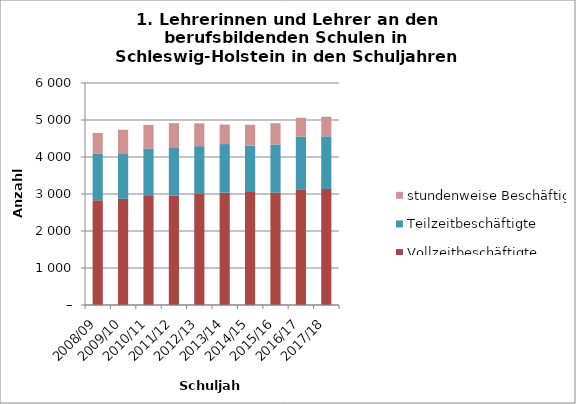
| Category | Vollzeitbeschäftigte | Teilzeitbeschäftigte | stundenweise Beschäftigte |
|---|---|---|---|
| 2008/09 | 2831 | 1252 | 565 |
| 2009/10 | 2870 | 1211 | 656 |
| 2010/11 | 2946 | 1283 | 638 |
| 2011/12 | 2952 | 1291 | 672 |
| 2012/13 | 3001 | 1292 | 617 |
| 2013/14 | 3036 | 1313 | 528 |
| 2014/15 | 3053 | 1254 | 564 |
| 2015/16 | 3038 | 1301 | 574 |
| 2016/17 | 3110 | 1444 | 507 |
| 2017/18 | 3132 | 1427 | 529 |